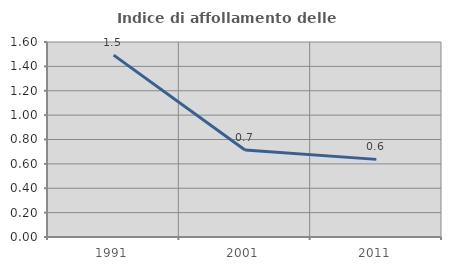
| Category | Indice di affollamento delle abitazioni  |
|---|---|
| 1991.0 | 1.493 |
| 2001.0 | 0.714 |
| 2011.0 | 0.637 |